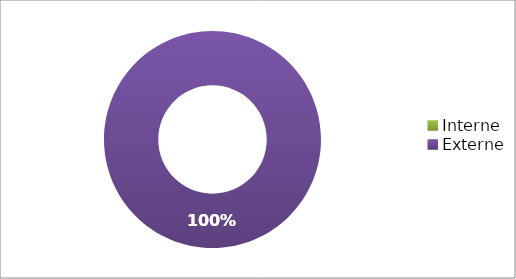
| Category | Series 0 |
|---|---|
| Interne | 0 |
| Externe | 1 |